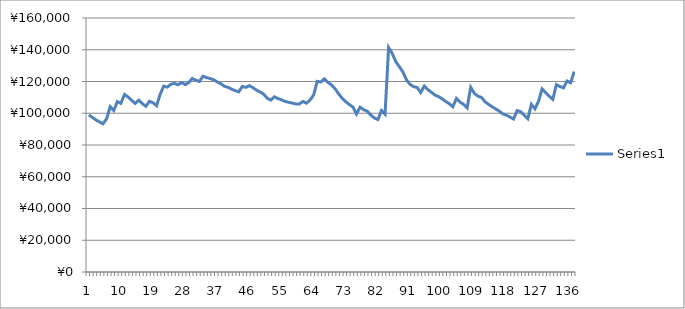
| Category | Series 0 |
|---|---|
| 0 | 98954.335 |
| 1 | 97386.214 |
| 2 | 95820.14 |
| 3 | 94510.824 |
| 4 | 93391.384 |
| 5 | 96568.444 |
| 6 | 104107.377 |
| 7 | 101750.996 |
| 8 | 107351.319 |
| 9 | 106235.972 |
| 10 | 111857.835 |
| 11 | 110269.575 |
| 12 | 108195.477 |
| 13 | 106205.708 |
| 14 | 108219.602 |
| 15 | 106068.928 |
| 16 | 104410.985 |
| 17 | 107566.505 |
| 18 | 106586.753 |
| 19 | 104760.366 |
| 20 | 111922.348 |
| 21 | 117091.869 |
| 22 | 116445.557 |
| 23 | 118276.36 |
| 24 | 118782.445 |
| 25 | 117920.732 |
| 26 | 119378.783 |
| 27 | 118019.494 |
| 28 | 119322.563 |
| 29 | 121950.35 |
| 30 | 120798.169 |
| 31 | 119989.445 |
| 32 | 123317.286 |
| 33 | 122472.698 |
| 34 | 121828.11 |
| 35 | 121127.733 |
| 36 | 119690.792 |
| 37 | 118632.095 |
| 38 | 116958.535 |
| 39 | 116315.455 |
| 40 | 115204.523 |
| 41 | 114225.74 |
| 42 | 113463.22 |
| 43 | 116909.532 |
| 44 | 116303.285 |
| 45 | 117413.57 |
| 46 | 116049.65 |
| 47 | 114521.055 |
| 48 | 113403.662 |
| 49 | 111968.336 |
| 50 | 109427.141 |
| 51 | 108289.822 |
| 52 | 110357.566 |
| 53 | 109244.157 |
| 54 | 108437.695 |
| 55 | 107446.634 |
| 56 | 106921.917 |
| 57 | 106424.771 |
| 58 | 105777.491 |
| 59 | 105863.543 |
| 60 | 107435.864 |
| 61 | 106354.873 |
| 62 | 108301.346 |
| 63 | 111565.32 |
| 64 | 120073.56 |
| 65 | 119653.419 |
| 66 | 121699.623 |
| 67 | 119440.388 |
| 68 | 117828.541 |
| 69 | 115426.71 |
| 70 | 112202.693 |
| 71 | 109384.168 |
| 72 | 107274.96 |
| 73 | 105442.757 |
| 74 | 103910.285 |
| 75 | 99520.194 |
| 76 | 103838.88 |
| 77 | 102208.185 |
| 78 | 101333.333 |
| 79 | 98874.96 |
| 80 | 97046.957 |
| 81 | 96046.096 |
| 82 | 101705.762 |
| 83 | 99347.011 |
| 84 | 141436.295 |
| 85 | 137748.95 |
| 86 | 132529.995 |
| 87 | 129331.179 |
| 88 | 126025.094 |
| 89 | 121108.131 |
| 90 | 118208.401 |
| 91 | 116763.92 |
| 92 | 116214.54 |
| 93 | 113037.264 |
| 94 | 117119.009 |
| 95 | 114877.975 |
| 96 | 113196.877 |
| 97 | 111409.693 |
| 98 | 110516.209 |
| 99 | 109085.299 |
| 100 | 107415.94 |
| 101 | 106023.91 |
| 102 | 104084.653 |
| 103 | 109306.408 |
| 104 | 107027.464 |
| 105 | 105608.185 |
| 106 | 103406.677 |
| 107 | 116362.951 |
| 108 | 112587.722 |
| 109 | 110803.877 |
| 110 | 109984.707 |
| 111 | 107294.13 |
| 112 | 105618.094 |
| 113 | 104084.653 |
| 114 | 102734.733 |
| 115 | 101325.04 |
| 116 | 99594.4 |
| 117 | 98791.922 |
| 118 | 97612.278 |
| 119 | 96361.874 |
| 120 | 101660.635 |
| 121 | 101003.554 |
| 122 | 98671.405 |
| 123 | 96545.288 |
| 124 | 105592.03 |
| 125 | 102782.229 |
| 126 | 107564.028 |
| 127 | 115372.213 |
| 128 | 112989.445 |
| 129 | 110725.256 |
| 130 | 108759.074 |
| 131 | 118053.527 |
| 132 | 116817.34 |
| 133 | 115970.167 |
| 134 | 120353.473 |
| 135 | 119233.818 |
| 136 | 126288.099 |